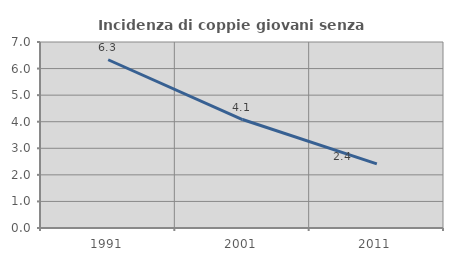
| Category | Incidenza di coppie giovani senza figli |
|---|---|
| 1991.0 | 6.332 |
| 2001.0 | 4.082 |
| 2011.0 | 2.414 |